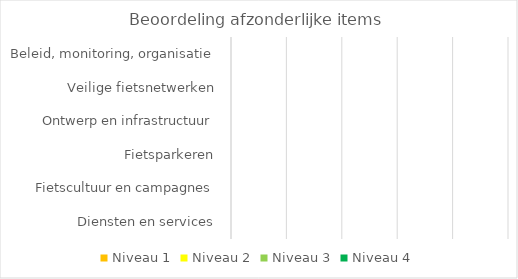
| Category | Niveau 1 | Niveau 2 | Niveau 3 | Niveau 4 |
|---|---|---|---|---|
| Beleid, monitoring, organisatie | 0 | 0 | 0 | 0 |
| Veilige fietsnetwerken | 0 | 0 | 0 | 0 |
| Ontwerp en infrastructuur | 0 | 0 | 0 | 0 |
| Fietsparkeren | 0 | 0 | 0 | 0 |
| Fietscultuur en campagnes | 0 | 0 | 0 | 0 |
| Diensten en services | 0 | 0 | 0 | 0 |